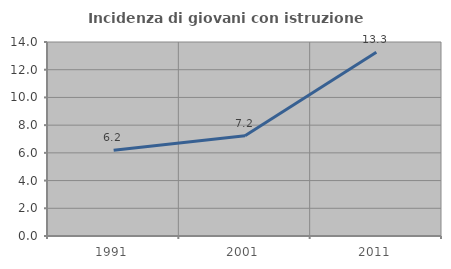
| Category | Incidenza di giovani con istruzione universitaria |
|---|---|
| 1991.0 | 6.195 |
| 2001.0 | 7.229 |
| 2011.0 | 13.253 |